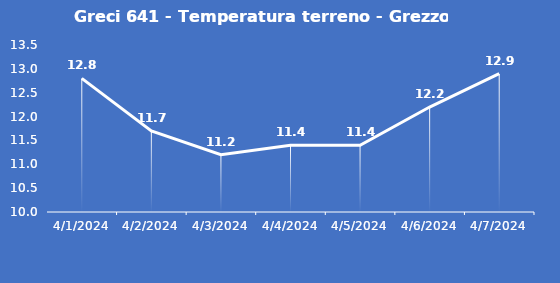
| Category | Greci 641 - Temperatura terreno - Grezzo (°C) |
|---|---|
| 4/1/24 | 12.8 |
| 4/2/24 | 11.7 |
| 4/3/24 | 11.2 |
| 4/4/24 | 11.4 |
| 4/5/24 | 11.4 |
| 4/6/24 | 12.2 |
| 4/7/24 | 12.9 |